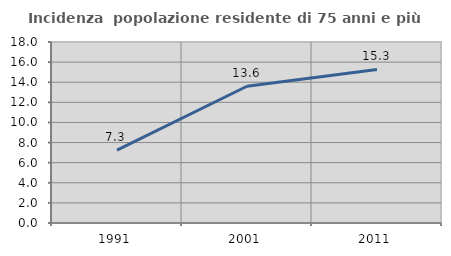
| Category | Incidenza  popolazione residente di 75 anni e più |
|---|---|
| 1991.0 | 7.252 |
| 2001.0 | 13.599 |
| 2011.0 | 15.275 |